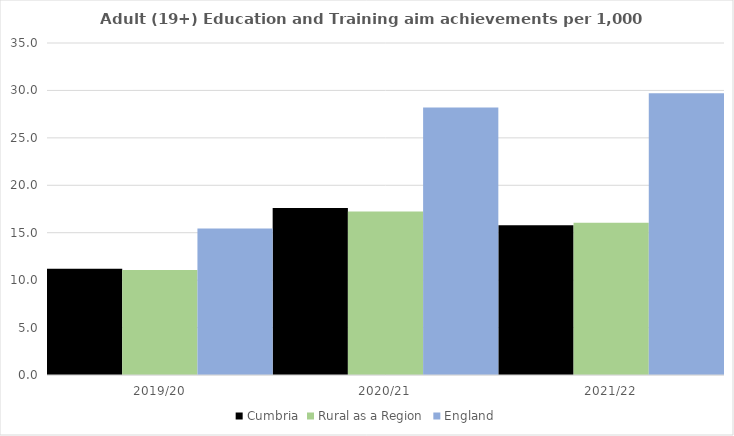
| Category | Cumbria | Rural as a Region | England |
|---|---|---|---|
| 2019/20 | 11.205 | 11.081 | 15.446 |
| 2020/21 | 17.592 | 17.224 | 28.211 |
| 2021/22 | 15.788 | 16.063 | 29.711 |